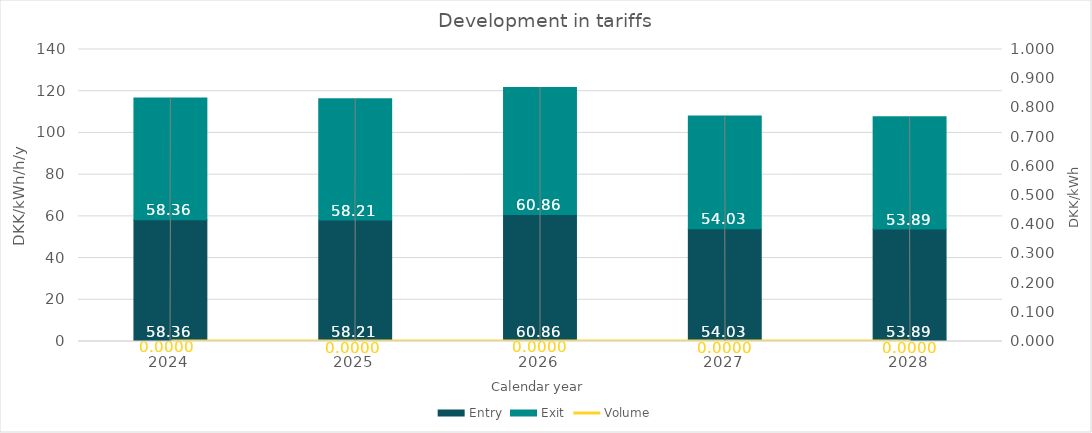
| Category | Entry | Exit |
|---|---|---|
| 2024.0 | 58.363 | 58.363 |
| 2025.0 | 58.212 | 58.212 |
| 2026.0 | 60.864 | 60.864 |
| 2027.0 | 54.032 | 54.032 |
| 2028.0 | 53.894 | 53.894 |